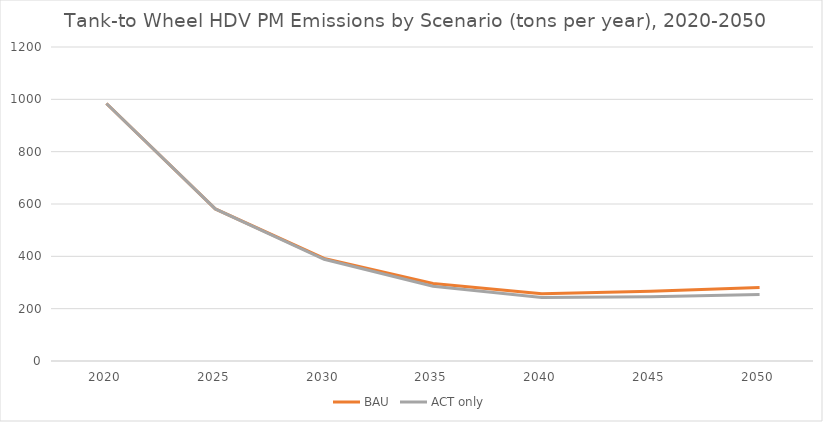
| Category | BAU | ACT only |
|---|---|---|
| 2020.0 | 983.999 | 983.999 |
| 2025.0 | 581.373 | 581.373 |
| 2030.0 | 391.788 | 388.577 |
| 2035.0 | 296.159 | 285.492 |
| 2040.0 | 256.828 | 242.634 |
| 2045.0 | 266.917 | 245.998 |
| 2050.0 | 281.271 | 254.42 |